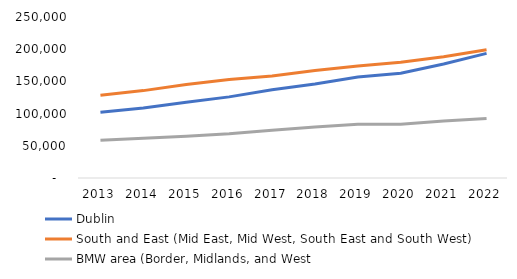
| Category | Dublin | South and East (Mid East, Mid West, South East and South West) | BMW area (Border, Midlands, and West |
|---|---|---|---|
| 2013.0 | 102231 | 128410 | 58713 |
| 2014.0 | 108809 | 135692 | 61606 |
| 2015.0 | 117783 | 145140 | 64888 |
| 2016.0 | 125949 | 152871 | 68547 |
| 2017.0 | 137186 | 158481 | 74086 |
| 2018.0 | 146073 | 166925 | 79326 |
| 2019.0 | 156779 | 173849 | 83352 |
| 2020.0 | 162696 | 179620 | 83646 |
| 2021.0 | 176923 | 188182 | 88444 |
| 2022.0 | 193464 | 199115 | 92399 |